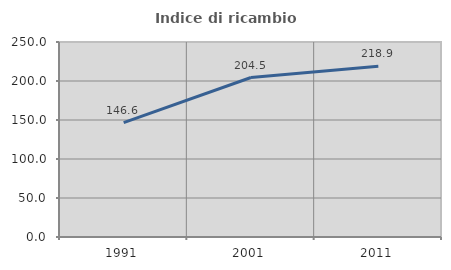
| Category | Indice di ricambio occupazionale  |
|---|---|
| 1991.0 | 146.643 |
| 2001.0 | 204.472 |
| 2011.0 | 218.9 |